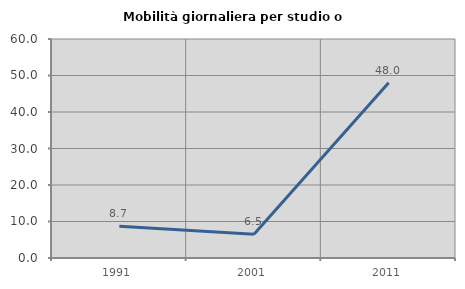
| Category | Mobilità giornaliera per studio o lavoro |
|---|---|
| 1991.0 | 8.696 |
| 2001.0 | 6.522 |
| 2011.0 | 48 |